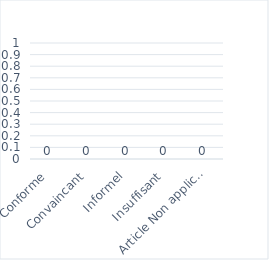
| Category | Niveaux de CONFORMITÉ des 134 SOUS-ARTICLES évalués |
|---|---|
| Conforme | 0 |
| Convaincant | 0 |
| Informel | 0 |
| Insuffisant | 0 |
| Article Non applicable | 0 |